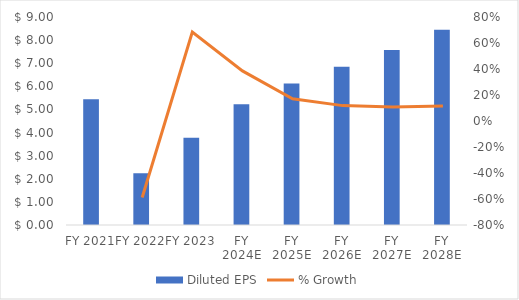
| Category | Diluted EPS |
|---|---|
| FY 2021 | 5.442 |
| FY 2022 | 2.241 |
| FY 2023 | 3.775 |
| FY 2024E | 5.229 |
| FY 2025E | 6.12 |
| FY 2026E | 6.844 |
| FY 2027E | 7.575 |
| FY 2028E | 8.451 |